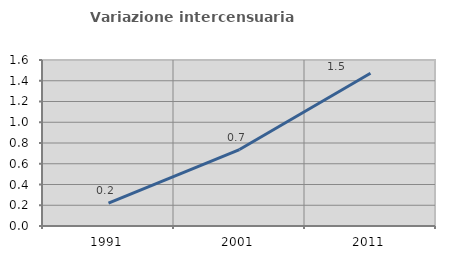
| Category | Variazione intercensuaria annua |
|---|---|
| 1991.0 | 0.22 |
| 2001.0 | 0.737 |
| 2011.0 | 1.472 |